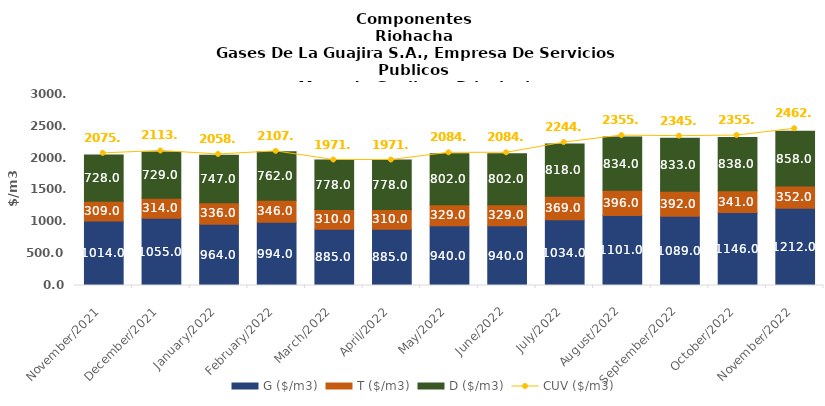
| Category | G ($/m3) | T ($/m3) | D ($/m3) |
|---|---|---|---|
| 2021-11-01 | 1014 | 309 | 728 |
| 2021-12-01 | 1055 | 314 | 729 |
| 2022-01-01 | 964 | 336 | 747 |
| 2022-02-01 | 994 | 346 | 762 |
| 2022-03-01 | 885 | 310 | 778 |
| 2022-04-01 | 885 | 310 | 778 |
| 2022-05-01 | 940 | 329 | 802 |
| 2022-06-01 | 940 | 329 | 802 |
| 2022-07-01 | 1034 | 369 | 818 |
| 2022-08-01 | 1101 | 396 | 834 |
| 2022-09-01 | 1089 | 392 | 833 |
| 2022-10-01 | 1146 | 341 | 838 |
| 2022-11-01 | 1212 | 352 | 858 |